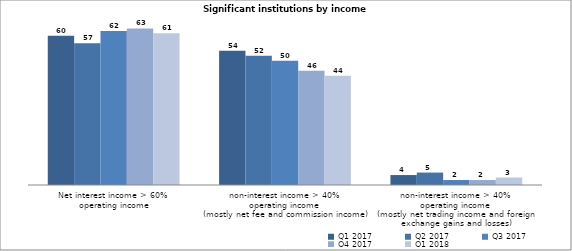
| Category | Q1 2017 | Q2 2017 | Q3 2017 | Q4 2017 | Q1 2018 |
|---|---|---|---|---|---|
| Net interest income > 60% 
operating income | 60 | 57 | 62 | 63 | 61 |
| non-interest income > 40% 
operating income 
(mostly net fee and commission income) | 54 | 52 | 50 | 46 | 44 |
| non-interest income > 40% 
operating income 
(mostly net trading income and foreign exchange gains and losses) | 4 | 5 | 2 | 2 | 3 |